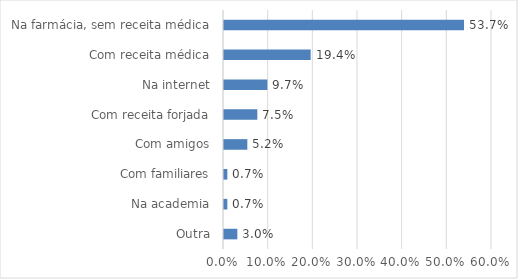
| Category | Series 0 |
|---|---|
| Outra | 0.03 |
| Na academia | 0.007 |
| Com familiares | 0.007 |
| Com amigos | 0.052 |
| Com receita forjada | 0.075 |
| Na internet | 0.097 |
| Com receita médica | 0.194 |
| Na farmácia, sem receita médica | 0.537 |